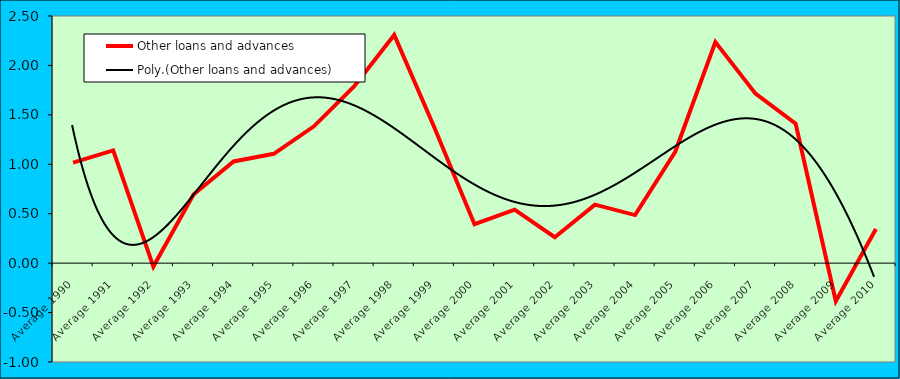
| Category | Other loans and advances |
|---|---|
| Average 1990 | 1.016 |
| Average 1991 | 1.14 |
| Average 1992 | -0.035 |
| Average 1993 | 0.694 |
| Average 1994 | 1.029 |
| Average 1995 | 1.106 |
| Average 1996 | 1.384 |
| Average 1997 | 1.788 |
| Average 1998 | 2.308 |
| Average 1999 | 1.373 |
| Average 2000 | 0.394 |
| Average 2001 | 0.541 |
| Average 2002 | 0.262 |
| Average 2003 | 0.592 |
| Average 2004 | 0.486 |
| Average 2005 | 1.127 |
| Average 2006 | 2.236 |
| Average 2007 | 1.715 |
| Average 2008 | 1.41 |
| Average 2009 | -0.386 |
| Average 2010 | 0.345 |